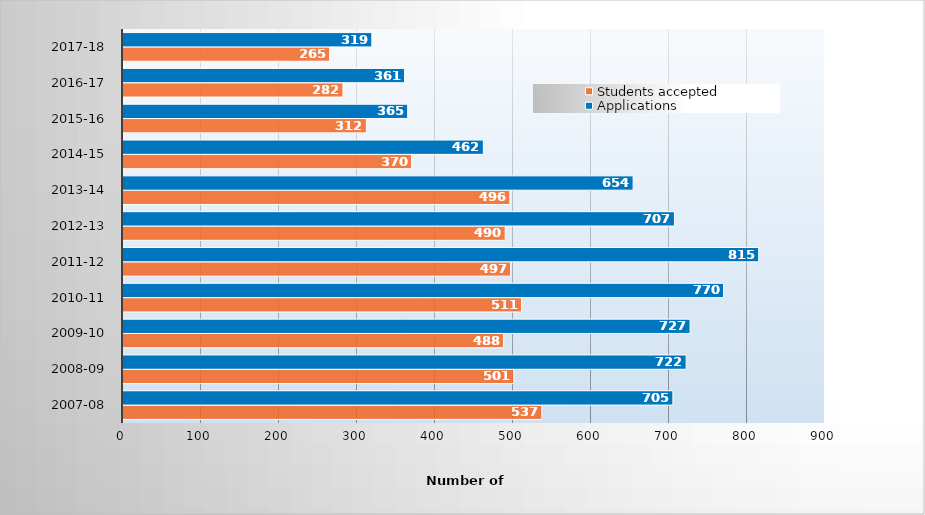
| Category | Students accepted | Applications |
|---|---|---|
| 2007-08 | 537 | 705 |
| 2008-09 | 501 | 722 |
| 2009-10 | 488 | 727 |
| 2010-11 | 511 | 770 |
| 2011-12 | 497 | 815 |
| 2012-13 | 490 | 707 |
| 2013-14 | 496 | 654 |
| 2014-15 | 370 | 462 |
| 2015-16 | 312 | 365 |
| 2016-17 | 282 | 361 |
| 2017-18 | 265 | 319 |